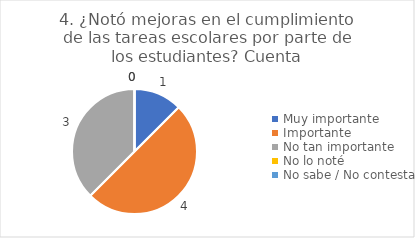
| Category | 4. ¿Notó mejoras en el cumplimiento de las tareas escolares por parte de los estudiantes? |
|---|---|
| Muy importante  | 0.125 |
| Importante  | 0.5 |
| No tan importante  | 0.375 |
| No lo noté  | 0 |
| No sabe / No contesta | 0 |